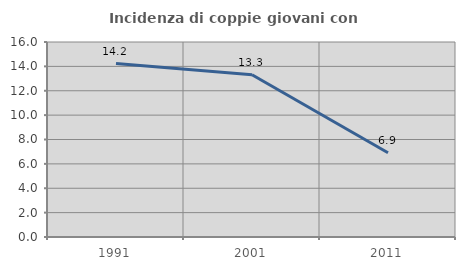
| Category | Incidenza di coppie giovani con figli |
|---|---|
| 1991.0 | 14.232 |
| 2001.0 | 13.309 |
| 2011.0 | 6.909 |